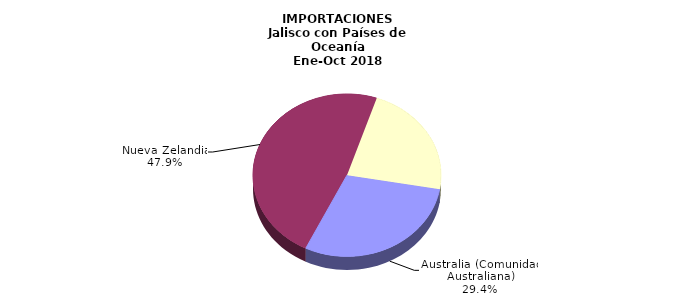
| Category | IMPORTACIONES |
|---|---|
| Australia (Comunidad Australiana) | 25.398 |
| Nueva Zelandia | 41.336 |
| Otros | 19.555 |